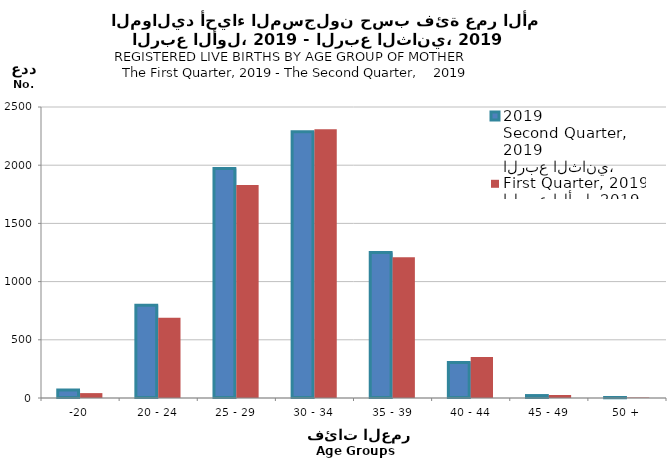
| Category | الربع الثاني، 2019
Second Quarter, 2019 | الربع الأول، 2019
First Quarter, 2019 |
|---|---|---|
| -20 | 68 | 42 |
| 20 - 24 | 797 | 690 |
| 25 - 29 | 1972 | 1829 |
| 30 - 34 | 2288 | 2309 |
| 35 - 39 | 1249 | 1209 |
| 40 - 44 | 306 | 352 |
| 45 - 49 | 21 | 26 |
| 50 + | 2 | 4 |